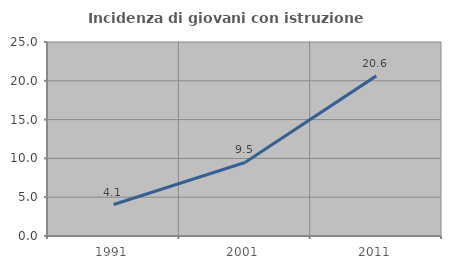
| Category | Incidenza di giovani con istruzione universitaria |
|---|---|
| 1991.0 | 4.054 |
| 2001.0 | 9.474 |
| 2011.0 | 20.635 |